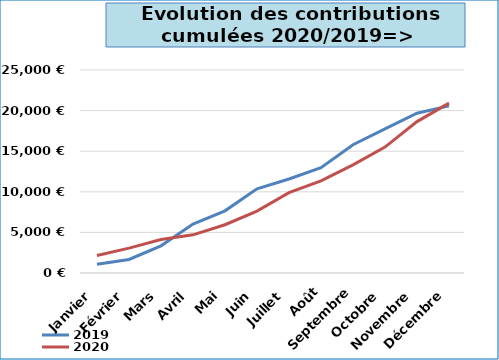
| Category | 2019 | 2020 |
|---|---|---|
| Janvier | 1066.94 | 2149.91 |
| Février | 1670.7 | 3067.32 |
| Mars | 3342.79 | 4115.08 |
| Avril | 6020.02 | 4700.08 |
| Mai | 7655.45 | 5943.88 |
| Juin | 10365.85 | 7617.44 |
| Juillet | 11571.69 | 9893.07 |
| Août | 12958.94 | 11356.42 |
| Septembre | 15799.6 | 13316.4 |
| Octobre | 17752.4 | 15507.25 |
| Novembre | 19674.27 | 18646.95 |
| Décembre | 20584.12 | 20922.15 |